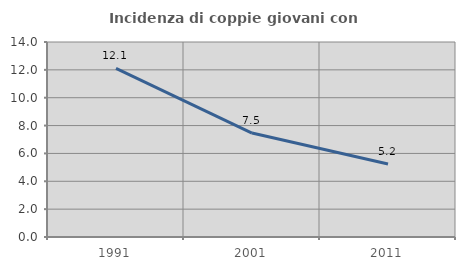
| Category | Incidenza di coppie giovani con figli |
|---|---|
| 1991.0 | 12.111 |
| 2001.0 | 7.465 |
| 2011.0 | 5.241 |